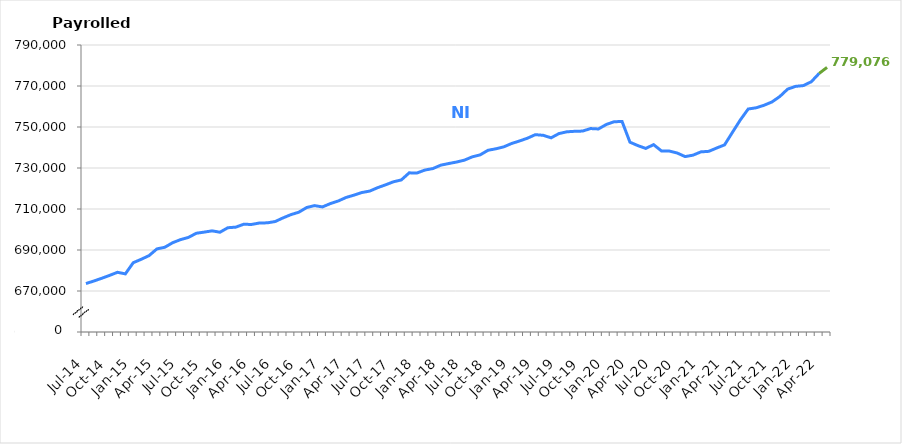
| Category | NI |
|---|---|
| Jul-14 | 673633 |
| Aug-14 | 674871 |
| Sep-14 | 676198 |
| Oct-14 | 677618 |
| Nov-14 | 679128 |
| Dec-14 | 678353 |
| Jan-15 | 683802 |
| Feb-15 | 685453 |
| Mar-15 | 687244 |
| Apr-15 | 690531 |
| May-15 | 691332 |
| Jun-15 | 693562 |
| Jul-15 | 695062 |
| Aug-15 | 696138 |
| Sep-15 | 698170 |
| Oct-15 | 698729 |
| Nov-15 | 699340 |
| Dec-15 | 698673 |
| Jan-16 | 700865 |
| Feb-16 | 701145 |
| Mar-16 | 702550 |
| Apr-16 | 702463 |
| May-16 | 703165 |
| Jun-16 | 703248 |
| Jul-16 | 703882 |
| Aug-16 | 705663 |
| Sep-16 | 707255 |
| Oct-16 | 708436 |
| Nov-16 | 710726 |
| Dec-16 | 711658 |
| Jan-17 | 711017 |
| Feb-17 | 712639 |
| Mar-17 | 713897 |
| Apr-17 | 715631 |
| May-17 | 716769 |
| Jun-17 | 718035 |
| Jul-17 | 718749 |
| Aug-17 | 720408 |
| Sep-17 | 721787 |
| Oct-17 | 723276 |
| Nov-17 | 724175 |
| Dec-17 | 727628 |
| Jan-18 | 727585 |
| Feb-18 | 729011 |
| Mar-18 | 729716 |
| Apr-18 | 731377 |
| May-18 | 732172 |
| Jun-18 | 732905 |
| Jul-18 | 733824 |
| Aug-18 | 735442 |
| Sep-18 | 736408 |
| Oct-18 | 738648 |
| Nov-18 | 739372 |
| Dec-18 | 740326 |
| Jan-19 | 741967 |
| Feb-19 | 743187 |
| Mar-19 | 744541 |
| Apr-19 | 746263 |
| May-19 | 745946 |
| Jun-19 | 744721 |
| Jul-19 | 746796 |
| Aug-19 | 747659 |
| Sep-19 | 747904 |
| Oct-19 | 748011 |
| Nov-19 | 749246 |
| Dec-19 | 749040 |
| Jan-20 | 751223 |
| Feb-20 | 752578 |
| Mar-20 | 752679 |
| Apr-20 | 742590 |
| May-20 | 740929 |
| Jun-20 | 739555 |
| Jul-20 | 741382 |
| Aug-20 | 738300 |
| Sep-20 | 738266 |
| Oct-20 | 737293 |
| Nov-20 | 735563 |
| Dec-20 | 736265 |
| Jan-21 | 737868 |
| Feb-21 | 738131 |
| Mar-21 | 739747 |
| Apr-21 | 741280 |
| May-21 | 747403 |
| Jun-21 | 753447 |
| Jul-21 | 758783 |
| Aug-21 | 759368 |
| Sep-21 | 760591 |
| Oct-21 | 762194 |
| Nov-21 | 764857 |
| Dec-21 | 768471 |
| Jan-22 | 769816 |
| Feb-22 | 770204 |
| Mar-22 | 772067 |
| Apr-22 | 776159 |
| May-22 | 779076 |